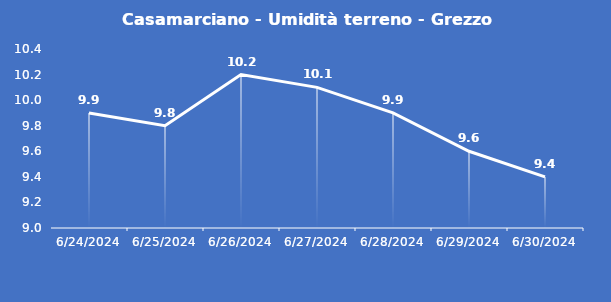
| Category | Casamarciano - Umidità terreno - Grezzo (%VWC) |
|---|---|
| 6/24/24 | 9.9 |
| 6/25/24 | 9.8 |
| 6/26/24 | 10.2 |
| 6/27/24 | 10.1 |
| 6/28/24 | 9.9 |
| 6/29/24 | 9.6 |
| 6/30/24 | 9.4 |